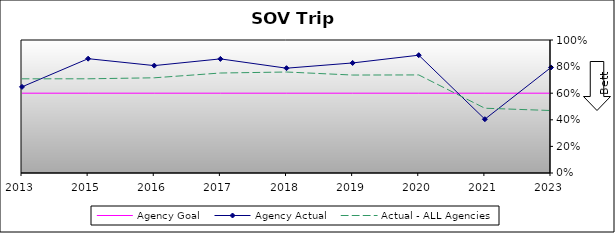
| Category | Agency Goal | Agency Actual | Actual - ALL Agencies |
|---|---|---|---|
| 2013.0 | 0.6 | 0.648 | 0.708 |
| 2015.0 | 0.6 | 0.86 | 0.708 |
| 2016.0 | 0.6 | 0.808 | 0.716 |
| 2017.0 | 0.6 | 0.858 | 0.752 |
| 2018.0 | 0.6 | 0.788 | 0.759 |
| 2019.0 | 0.6 | 0.828 | 0.736 |
| 2020.0 | 0.6 | 0.886 | 0.737 |
| 2021.0 | 0.6 | 0.404 | 0.487 |
| 2023.0 | 0.6 | 0.794 | 0.47 |